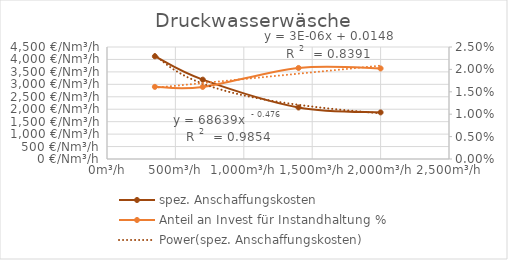
| Category | spez. Anschaffungskosten |
|---|---|
| 350.0 | 4125.654 |
| 700.0 | 3188.306 |
| 1400.0 | 2069.429 |
| 2000.0 | 1872.264 |